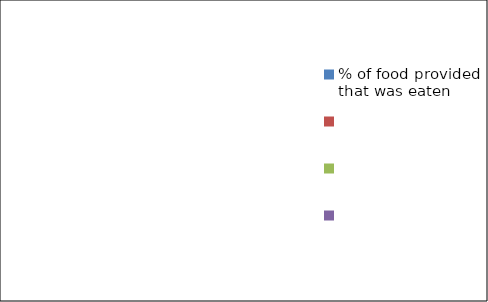
| Category | Series 0 |
|---|---|
| % of food provided that was eaten | 0 |
| % of food provided that was unserved | 0 |
| % of food provided that was uneaten | 0 |
| % of food provided that was untouched | 0 |